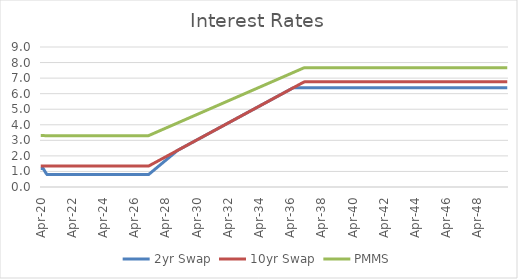
| Category | 2yr Swap | 10yr Swap | PMMS |
|---|---|---|---|
| 2020-04-30 | 1.182 | 1.344 | 3.303 |
| 2020-05-31 | 1.182 | 1.344 | 3.303 |
| 2020-06-30 | 1.182 | 1.344 | 3.303 |
| 2020-07-31 | 1.043 | 1.344 | 3.303 |
| 2020-08-31 | 0.903 | 1.344 | 3.302 |
| 2020-09-30 | 0.798 | 1.344 | 3.302 |
| 2020-10-31 | 0.798 | 1.344 | 3.302 |
| 2020-11-30 | 0.798 | 1.344 | 3.302 |
| 2020-12-31 | 0.798 | 1.344 | 3.302 |
| 2021-01-31 | 0.798 | 1.344 | 3.302 |
| 2021-02-28 | 0.798 | 1.344 | 3.302 |
| 2021-03-31 | 0.798 | 1.344 | 3.302 |
| 2021-04-30 | 0.798 | 1.344 | 3.302 |
| 2021-05-31 | 0.798 | 1.344 | 3.302 |
| 2021-06-30 | 0.798 | 1.344 | 3.302 |
| 2021-07-31 | 0.798 | 1.344 | 3.302 |
| 2021-08-31 | 0.798 | 1.344 | 3.302 |
| 2021-09-30 | 0.798 | 1.344 | 3.302 |
| 2021-10-31 | 0.798 | 1.344 | 3.302 |
| 2021-11-30 | 0.798 | 1.344 | 3.302 |
| 2021-12-31 | 0.798 | 1.344 | 3.302 |
| 2022-01-31 | 0.798 | 1.344 | 3.302 |
| 2022-02-28 | 0.798 | 1.344 | 3.302 |
| 2022-03-31 | 0.798 | 1.344 | 3.302 |
| 2022-04-30 | 0.798 | 1.344 | 3.302 |
| 2022-05-31 | 0.798 | 1.344 | 3.302 |
| 2022-06-30 | 0.798 | 1.344 | 3.302 |
| 2022-07-31 | 0.798 | 1.344 | 3.302 |
| 2022-08-31 | 0.798 | 1.344 | 3.302 |
| 2022-09-30 | 0.798 | 1.344 | 3.302 |
| 2022-10-31 | 0.798 | 1.344 | 3.302 |
| 2022-11-30 | 0.798 | 1.344 | 3.302 |
| 2022-12-31 | 0.798 | 1.344 | 3.302 |
| 2023-01-31 | 0.798 | 1.344 | 3.302 |
| 2023-02-28 | 0.798 | 1.344 | 3.302 |
| 2023-03-31 | 0.798 | 1.344 | 3.302 |
| 2023-04-30 | 0.798 | 1.344 | 3.302 |
| 2023-05-31 | 0.798 | 1.344 | 3.302 |
| 2023-06-30 | 0.798 | 1.344 | 3.302 |
| 2023-07-31 | 0.798 | 1.344 | 3.302 |
| 2023-08-31 | 0.798 | 1.344 | 3.302 |
| 2023-09-30 | 0.798 | 1.344 | 3.302 |
| 2023-10-31 | 0.798 | 1.344 | 3.302 |
| 2023-11-30 | 0.798 | 1.344 | 3.302 |
| 2023-12-31 | 0.798 | 1.344 | 3.302 |
| 2024-01-31 | 0.798 | 1.344 | 3.302 |
| 2024-02-29 | 0.798 | 1.344 | 3.302 |
| 2024-03-31 | 0.798 | 1.344 | 3.302 |
| 2024-04-30 | 0.798 | 1.344 | 3.302 |
| 2024-05-31 | 0.798 | 1.344 | 3.302 |
| 2024-06-30 | 0.798 | 1.344 | 3.302 |
| 2024-07-31 | 0.798 | 1.344 | 3.302 |
| 2024-08-31 | 0.798 | 1.344 | 3.302 |
| 2024-09-30 | 0.798 | 1.344 | 3.302 |
| 2024-10-31 | 0.798 | 1.344 | 3.302 |
| 2024-11-30 | 0.798 | 1.344 | 3.302 |
| 2024-12-31 | 0.798 | 1.344 | 3.302 |
| 2025-01-31 | 0.798 | 1.344 | 3.302 |
| 2025-02-28 | 0.798 | 1.344 | 3.302 |
| 2025-03-31 | 0.798 | 1.344 | 3.302 |
| 2025-04-30 | 0.798 | 1.344 | 3.302 |
| 2025-05-31 | 0.798 | 1.344 | 3.302 |
| 2025-06-30 | 0.798 | 1.344 | 3.302 |
| 2025-07-31 | 0.798 | 1.344 | 3.302 |
| 2025-08-31 | 0.798 | 1.344 | 3.302 |
| 2025-09-30 | 0.798 | 1.344 | 3.302 |
| 2025-10-31 | 0.798 | 1.344 | 3.302 |
| 2025-11-30 | 0.798 | 1.344 | 3.302 |
| 2025-12-31 | 0.798 | 1.344 | 3.302 |
| 2026-01-31 | 0.798 | 1.344 | 3.302 |
| 2026-02-28 | 0.798 | 1.344 | 3.302 |
| 2026-03-31 | 0.798 | 1.344 | 3.302 |
| 2026-04-30 | 0.798 | 1.344 | 3.302 |
| 2026-05-31 | 0.798 | 1.344 | 3.302 |
| 2026-06-30 | 0.798 | 1.344 | 3.302 |
| 2026-07-31 | 0.798 | 1.344 | 3.302 |
| 2026-08-31 | 0.798 | 1.344 | 3.302 |
| 2026-09-30 | 0.798 | 1.344 | 3.302 |
| 2026-10-31 | 0.798 | 1.344 | 3.302 |
| 2026-11-30 | 0.798 | 1.344 | 3.302 |
| 2026-12-31 | 0.798 | 1.344 | 3.302 |
| 2027-01-31 | 0.798 | 1.344 | 3.302 |
| 2027-02-28 | 0.798 | 1.344 | 3.302 |
| 2027-03-31 | 0.798 | 1.344 | 3.302 |
| 2027-04-30 | 0.868 | 1.389 | 3.339 |
| 2027-05-31 | 0.938 | 1.434 | 3.375 |
| 2027-06-30 | 1.007 | 1.48 | 3.412 |
| 2027-07-31 | 1.077 | 1.525 | 3.448 |
| 2027-08-31 | 1.147 | 1.57 | 3.485 |
| 2027-09-30 | 1.216 | 1.615 | 3.521 |
| 2027-10-31 | 1.286 | 1.661 | 3.558 |
| 2027-11-30 | 1.356 | 1.706 | 3.594 |
| 2027-12-31 | 1.425 | 1.751 | 3.631 |
| 2028-01-31 | 1.495 | 1.796 | 3.667 |
| 2028-02-29 | 1.565 | 1.841 | 3.704 |
| 2028-03-31 | 1.634 | 1.887 | 3.74 |
| 2028-04-30 | 1.704 | 1.932 | 3.777 |
| 2028-05-31 | 1.774 | 1.977 | 3.813 |
| 2028-06-30 | 1.843 | 2.022 | 3.85 |
| 2028-07-31 | 1.913 | 2.068 | 3.886 |
| 2028-08-31 | 1.983 | 2.113 | 3.923 |
| 2028-09-30 | 2.052 | 2.158 | 3.959 |
| 2028-10-31 | 2.122 | 2.203 | 3.996 |
| 2028-11-30 | 2.192 | 2.248 | 4.032 |
| 2028-12-31 | 2.261 | 2.294 | 4.068 |
| 2029-01-31 | 2.331 | 2.339 | 4.105 |
| 2029-02-28 | 2.384 | 2.384 | 4.141 |
| 2029-03-31 | 2.429 | 2.429 | 4.178 |
| 2029-04-30 | 2.475 | 2.475 | 4.214 |
| 2029-05-31 | 2.52 | 2.52 | 4.251 |
| 2029-06-30 | 2.565 | 2.565 | 4.287 |
| 2029-07-31 | 2.61 | 2.61 | 4.324 |
| 2029-08-31 | 2.655 | 2.655 | 4.36 |
| 2029-09-30 | 2.701 | 2.701 | 4.397 |
| 2029-10-31 | 2.746 | 2.746 | 4.433 |
| 2029-11-30 | 2.791 | 2.791 | 4.47 |
| 2029-12-31 | 2.836 | 2.836 | 4.506 |
| 2030-01-31 | 2.882 | 2.882 | 4.543 |
| 2030-02-28 | 2.927 | 2.927 | 4.579 |
| 2030-03-31 | 2.972 | 2.972 | 4.615 |
| 2030-04-30 | 3.017 | 3.017 | 4.652 |
| 2030-05-31 | 3.062 | 3.062 | 4.688 |
| 2030-06-30 | 3.108 | 3.108 | 4.725 |
| 2030-07-31 | 3.153 | 3.153 | 4.761 |
| 2030-08-31 | 3.198 | 3.198 | 4.798 |
| 2030-09-30 | 3.243 | 3.243 | 4.834 |
| 2030-10-31 | 3.289 | 3.289 | 4.871 |
| 2030-11-30 | 3.334 | 3.334 | 4.907 |
| 2030-12-31 | 3.379 | 3.379 | 4.944 |
| 2031-01-31 | 3.424 | 3.424 | 4.98 |
| 2031-02-28 | 3.469 | 3.469 | 5.017 |
| 2031-03-31 | 3.515 | 3.515 | 5.053 |
| 2031-04-30 | 3.56 | 3.56 | 5.089 |
| 2031-05-31 | 3.605 | 3.605 | 5.126 |
| 2031-06-30 | 3.65 | 3.65 | 5.162 |
| 2031-07-31 | 3.695 | 3.695 | 5.199 |
| 2031-08-31 | 3.741 | 3.741 | 5.235 |
| 2031-09-30 | 3.786 | 3.786 | 5.272 |
| 2031-10-31 | 3.831 | 3.831 | 5.308 |
| 2031-11-30 | 3.876 | 3.876 | 5.345 |
| 2031-12-31 | 3.922 | 3.922 | 5.381 |
| 2032-01-31 | 3.967 | 3.967 | 5.418 |
| 2032-02-29 | 4.012 | 4.012 | 5.454 |
| 2032-03-31 | 4.057 | 4.057 | 5.491 |
| 2032-04-30 | 4.102 | 4.102 | 5.527 |
| 2032-05-31 | 4.148 | 4.148 | 5.563 |
| 2032-06-30 | 4.193 | 4.193 | 5.6 |
| 2032-07-31 | 4.238 | 4.238 | 5.636 |
| 2032-08-31 | 4.283 | 4.283 | 5.673 |
| 2032-09-30 | 4.329 | 4.329 | 5.709 |
| 2032-10-31 | 4.374 | 4.374 | 5.746 |
| 2032-11-30 | 4.419 | 4.419 | 5.782 |
| 2032-12-31 | 4.464 | 4.464 | 5.819 |
| 2033-01-31 | 4.509 | 4.509 | 5.855 |
| 2033-02-28 | 4.555 | 4.555 | 5.892 |
| 2033-03-31 | 4.6 | 4.6 | 5.928 |
| 2033-04-30 | 4.645 | 4.645 | 5.965 |
| 2033-05-31 | 4.69 | 4.69 | 6.001 |
| 2033-06-30 | 4.736 | 4.736 | 6.037 |
| 2033-07-31 | 4.781 | 4.781 | 6.074 |
| 2033-08-31 | 4.826 | 4.826 | 6.11 |
| 2033-09-30 | 4.871 | 4.871 | 6.147 |
| 2033-10-31 | 4.916 | 4.916 | 6.183 |
| 2033-11-30 | 4.962 | 4.962 | 6.22 |
| 2033-12-31 | 5.007 | 5.007 | 6.256 |
| 2034-01-31 | 5.052 | 5.052 | 6.293 |
| 2034-02-28 | 5.097 | 5.097 | 6.329 |
| 2034-03-31 | 5.143 | 5.143 | 6.366 |
| 2034-04-30 | 5.188 | 5.188 | 6.402 |
| 2034-05-31 | 5.233 | 5.233 | 6.439 |
| 2034-06-30 | 5.278 | 5.278 | 6.475 |
| 2034-07-31 | 5.323 | 5.323 | 6.511 |
| 2034-08-31 | 5.369 | 5.369 | 6.548 |
| 2034-09-30 | 5.414 | 5.414 | 6.584 |
| 2034-10-31 | 5.459 | 5.459 | 6.621 |
| 2034-11-30 | 5.504 | 5.504 | 6.657 |
| 2034-12-31 | 5.55 | 5.55 | 6.694 |
| 2035-01-31 | 5.595 | 5.595 | 6.73 |
| 2035-02-28 | 5.64 | 5.64 | 6.767 |
| 2035-03-31 | 5.685 | 5.685 | 6.803 |
| 2035-04-30 | 5.73 | 5.73 | 6.84 |
| 2035-05-31 | 5.776 | 5.776 | 6.876 |
| 2035-06-30 | 5.821 | 5.821 | 6.913 |
| 2035-07-31 | 5.866 | 5.866 | 6.949 |
| 2035-08-31 | 5.911 | 5.911 | 6.985 |
| 2035-09-30 | 5.957 | 5.957 | 7.022 |
| 2035-10-31 | 6.002 | 6.002 | 7.058 |
| 2035-11-30 | 6.047 | 6.047 | 7.095 |
| 2035-12-31 | 6.092 | 6.092 | 7.131 |
| 2036-01-31 | 6.137 | 6.137 | 7.168 |
| 2036-02-29 | 6.183 | 6.183 | 7.204 |
| 2036-03-31 | 6.228 | 6.228 | 7.241 |
| 2036-04-30 | 6.273 | 6.273 | 7.277 |
| 2036-05-31 | 6.318 | 6.318 | 7.314 |
| 2036-06-30 | 6.364 | 6.364 | 7.35 |
| 2036-07-31 | 6.387 | 6.409 | 7.387 |
| 2036-08-31 | 6.387 | 6.454 | 7.423 |
| 2036-09-30 | 6.387 | 6.499 | 7.459 |
| 2036-10-31 | 6.387 | 6.544 | 7.496 |
| 2036-11-30 | 6.387 | 6.59 | 7.532 |
| 2036-12-31 | 6.387 | 6.635 | 7.569 |
| 2037-01-31 | 6.387 | 6.68 | 7.605 |
| 2037-02-28 | 6.387 | 6.725 | 7.642 |
| 2037-03-31 | 6.387 | 6.758 | 7.668 |
| 2037-04-30 | 6.387 | 6.758 | 7.668 |
| 2037-05-31 | 6.387 | 6.758 | 7.668 |
| 2037-06-30 | 6.387 | 6.758 | 7.668 |
| 2037-07-31 | 6.387 | 6.758 | 7.668 |
| 2037-08-31 | 6.387 | 6.758 | 7.668 |
| 2037-09-30 | 6.387 | 6.758 | 7.668 |
| 2037-10-31 | 6.387 | 6.758 | 7.668 |
| 2037-11-30 | 6.387 | 6.758 | 7.668 |
| 2037-12-31 | 6.387 | 6.758 | 7.668 |
| 2038-01-31 | 6.387 | 6.758 | 7.668 |
| 2038-02-28 | 6.387 | 6.758 | 7.668 |
| 2038-03-31 | 6.387 | 6.758 | 7.668 |
| 2038-04-30 | 6.387 | 6.758 | 7.668 |
| 2038-05-31 | 6.387 | 6.758 | 7.668 |
| 2038-06-30 | 6.387 | 6.758 | 7.668 |
| 2038-07-31 | 6.387 | 6.758 | 7.668 |
| 2038-08-31 | 6.387 | 6.758 | 7.668 |
| 2038-09-30 | 6.387 | 6.758 | 7.668 |
| 2038-10-31 | 6.387 | 6.758 | 7.668 |
| 2038-11-30 | 6.387 | 6.758 | 7.668 |
| 2038-12-31 | 6.387 | 6.758 | 7.668 |
| 2039-01-31 | 6.387 | 6.758 | 7.668 |
| 2039-02-28 | 6.387 | 6.758 | 7.668 |
| 2039-03-31 | 6.387 | 6.758 | 7.668 |
| 2039-04-30 | 6.387 | 6.758 | 7.668 |
| 2039-05-31 | 6.387 | 6.758 | 7.668 |
| 2039-06-30 | 6.387 | 6.758 | 7.668 |
| 2039-07-31 | 6.387 | 6.758 | 7.668 |
| 2039-08-31 | 6.387 | 6.758 | 7.668 |
| 2039-09-30 | 6.387 | 6.758 | 7.668 |
| 2039-10-31 | 6.387 | 6.758 | 7.668 |
| 2039-11-30 | 6.387 | 6.758 | 7.668 |
| 2039-12-31 | 6.387 | 6.758 | 7.668 |
| 2040-01-31 | 6.387 | 6.758 | 7.668 |
| 2040-02-29 | 6.387 | 6.758 | 7.668 |
| 2040-03-31 | 6.387 | 6.758 | 7.668 |
| 2040-04-30 | 6.387 | 6.758 | 7.668 |
| 2040-05-31 | 6.387 | 6.758 | 7.668 |
| 2040-06-30 | 6.387 | 6.758 | 7.668 |
| 2040-07-31 | 6.387 | 6.758 | 7.668 |
| 2040-08-31 | 6.387 | 6.758 | 7.668 |
| 2040-09-30 | 6.387 | 6.758 | 7.668 |
| 2040-10-31 | 6.387 | 6.758 | 7.668 |
| 2040-11-30 | 6.387 | 6.758 | 7.668 |
| 2040-12-31 | 6.387 | 6.758 | 7.668 |
| 2041-01-31 | 6.387 | 6.758 | 7.668 |
| 2041-02-28 | 6.387 | 6.758 | 7.668 |
| 2041-03-31 | 6.387 | 6.758 | 7.668 |
| 2041-04-30 | 6.387 | 6.758 | 7.668 |
| 2041-05-31 | 6.387 | 6.758 | 7.668 |
| 2041-06-30 | 6.387 | 6.758 | 7.668 |
| 2041-07-31 | 6.387 | 6.758 | 7.668 |
| 2041-08-31 | 6.387 | 6.758 | 7.668 |
| 2041-09-30 | 6.387 | 6.758 | 7.668 |
| 2041-10-31 | 6.387 | 6.758 | 7.668 |
| 2041-11-30 | 6.387 | 6.758 | 7.668 |
| 2041-12-31 | 6.387 | 6.758 | 7.668 |
| 2042-01-31 | 6.387 | 6.758 | 7.668 |
| 2042-02-28 | 6.387 | 6.758 | 7.668 |
| 2042-03-31 | 6.387 | 6.758 | 7.668 |
| 2042-04-30 | 6.387 | 6.758 | 7.668 |
| 2042-05-31 | 6.387 | 6.758 | 7.668 |
| 2042-06-30 | 6.387 | 6.758 | 7.668 |
| 2042-07-31 | 6.387 | 6.758 | 7.668 |
| 2042-08-31 | 6.387 | 6.758 | 7.668 |
| 2042-09-30 | 6.387 | 6.758 | 7.668 |
| 2042-10-31 | 6.387 | 6.758 | 7.668 |
| 2042-11-30 | 6.387 | 6.758 | 7.668 |
| 2042-12-31 | 6.387 | 6.758 | 7.668 |
| 2043-01-31 | 6.387 | 6.758 | 7.668 |
| 2043-02-28 | 6.387 | 6.758 | 7.668 |
| 2043-03-31 | 6.387 | 6.758 | 7.668 |
| 2043-04-30 | 6.387 | 6.758 | 7.668 |
| 2043-05-31 | 6.387 | 6.758 | 7.668 |
| 2043-06-30 | 6.387 | 6.758 | 7.668 |
| 2043-07-31 | 6.387 | 6.758 | 7.668 |
| 2043-08-31 | 6.387 | 6.758 | 7.668 |
| 2043-09-30 | 6.387 | 6.758 | 7.668 |
| 2043-10-31 | 6.387 | 6.758 | 7.668 |
| 2043-11-30 | 6.387 | 6.758 | 7.668 |
| 2043-12-31 | 6.387 | 6.758 | 7.668 |
| 2044-01-31 | 6.387 | 6.758 | 7.668 |
| 2044-02-29 | 6.387 | 6.758 | 7.668 |
| 2044-03-31 | 6.387 | 6.758 | 7.668 |
| 2044-04-30 | 6.387 | 6.758 | 7.668 |
| 2044-05-31 | 6.387 | 6.758 | 7.668 |
| 2044-06-30 | 6.387 | 6.758 | 7.668 |
| 2044-07-31 | 6.387 | 6.758 | 7.668 |
| 2044-08-31 | 6.387 | 6.758 | 7.668 |
| 2044-09-30 | 6.387 | 6.758 | 7.668 |
| 2044-10-31 | 6.387 | 6.758 | 7.668 |
| 2044-11-30 | 6.387 | 6.758 | 7.668 |
| 2044-12-31 | 6.387 | 6.758 | 7.668 |
| 2045-01-31 | 6.387 | 6.758 | 7.668 |
| 2045-02-28 | 6.387 | 6.758 | 7.668 |
| 2045-03-31 | 6.387 | 6.758 | 7.668 |
| 2045-04-30 | 6.387 | 6.758 | 7.668 |
| 2045-05-31 | 6.387 | 6.758 | 7.668 |
| 2045-06-30 | 6.387 | 6.758 | 7.668 |
| 2045-07-31 | 6.387 | 6.758 | 7.668 |
| 2045-08-31 | 6.387 | 6.758 | 7.668 |
| 2045-09-30 | 6.387 | 6.758 | 7.668 |
| 2045-10-31 | 6.387 | 6.758 | 7.668 |
| 2045-11-30 | 6.387 | 6.758 | 7.668 |
| 2045-12-31 | 6.387 | 6.758 | 7.668 |
| 2046-01-31 | 6.387 | 6.758 | 7.668 |
| 2046-02-28 | 6.387 | 6.758 | 7.668 |
| 2046-03-31 | 6.387 | 6.758 | 7.668 |
| 2046-04-30 | 6.387 | 6.758 | 7.668 |
| 2046-05-31 | 6.387 | 6.758 | 7.668 |
| 2046-06-30 | 6.387 | 6.758 | 7.668 |
| 2046-07-31 | 6.387 | 6.758 | 7.668 |
| 2046-08-31 | 6.387 | 6.758 | 7.668 |
| 2046-09-30 | 6.387 | 6.758 | 7.668 |
| 2046-10-31 | 6.387 | 6.758 | 7.668 |
| 2046-11-30 | 6.387 | 6.758 | 7.668 |
| 2046-12-31 | 6.387 | 6.758 | 7.668 |
| 2047-01-31 | 6.387 | 6.758 | 7.668 |
| 2047-02-28 | 6.387 | 6.758 | 7.668 |
| 2047-03-31 | 6.387 | 6.758 | 7.668 |
| 2047-04-30 | 6.387 | 6.758 | 7.668 |
| 2047-05-31 | 6.387 | 6.758 | 7.668 |
| 2047-06-30 | 6.387 | 6.758 | 7.668 |
| 2047-07-31 | 6.387 | 6.758 | 7.668 |
| 2047-08-31 | 6.387 | 6.758 | 7.668 |
| 2047-09-30 | 6.387 | 6.758 | 7.668 |
| 2047-10-31 | 6.387 | 6.758 | 7.668 |
| 2047-11-30 | 6.387 | 6.758 | 7.668 |
| 2047-12-31 | 6.387 | 6.758 | 7.668 |
| 2048-01-31 | 6.387 | 6.758 | 7.668 |
| 2048-02-29 | 6.387 | 6.758 | 7.668 |
| 2048-03-31 | 6.387 | 6.758 | 7.668 |
| 2048-04-30 | 6.387 | 6.758 | 7.668 |
| 2048-05-31 | 6.387 | 6.758 | 7.668 |
| 2048-06-30 | 6.387 | 6.758 | 7.668 |
| 2048-07-31 | 6.387 | 6.758 | 7.668 |
| 2048-08-31 | 6.387 | 6.758 | 7.668 |
| 2048-09-30 | 6.387 | 6.758 | 7.668 |
| 2048-10-31 | 6.387 | 6.758 | 7.668 |
| 2048-11-30 | 6.387 | 6.758 | 7.668 |
| 2048-12-31 | 6.387 | 6.758 | 7.668 |
| 2049-01-31 | 6.387 | 6.758 | 7.668 |
| 2049-02-28 | 6.387 | 6.758 | 7.668 |
| 2049-03-31 | 6.387 | 6.758 | 7.668 |
| 2049-04-30 | 6.387 | 6.758 | 7.668 |
| 2049-05-31 | 6.387 | 6.758 | 7.668 |
| 2049-06-30 | 6.387 | 6.758 | 7.668 |
| 2049-07-31 | 6.387 | 6.758 | 7.668 |
| 2049-08-31 | 6.387 | 6.758 | 7.668 |
| 2049-09-30 | 6.387 | 6.758 | 7.668 |
| 2049-10-31 | 6.387 | 6.758 | 7.668 |
| 2049-11-30 | 6.387 | 6.758 | 7.668 |
| 2049-12-31 | 6.387 | 6.758 | 7.668 |
| 2050-01-31 | 6.387 | 6.758 | 7.668 |
| 2050-02-28 | 6.387 | 6.758 | 7.668 |
| 2050-03-31 | 6.387 | 6.758 | 7.668 |